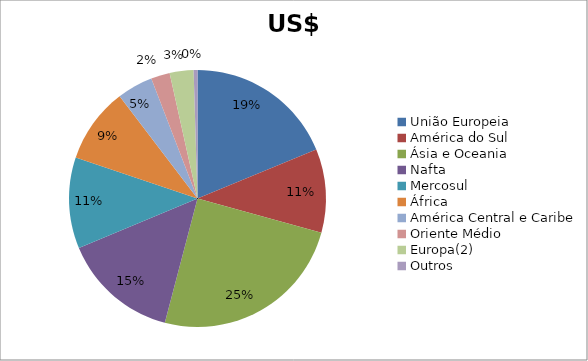
| Category | Series 0 |
|---|---|
| União Europeia | 2324115517 |
| América do Sul | 1302651856 |
| Ásia e Oceania | 3073068488 |
| Nafta | 1811223074 |
| Mercosul | 1418592031 |
| África | 1172461912 |
| América Central e Caribe | 558357371 |
| Oriente Médio | 293467599 |
| Europa(2) | 371451885 |
| Outros | 60003510 |